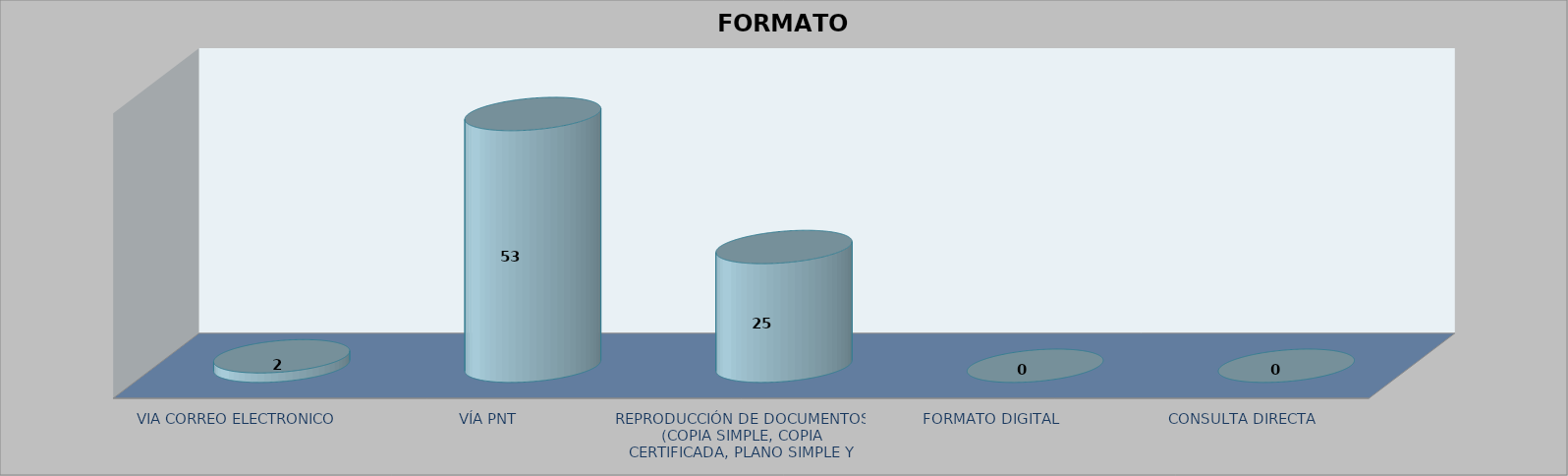
| Category |        FORMATO SOLICITADO | Series 1 | Series 2 |
|---|---|---|---|
| VIA CORREO ELECTRONICO |  |  | 2 |
| VÍA PNT |  |  | 53 |
| REPRODUCCIÓN DE DOCUMENTOS (COPIA SIMPLE, COPIA CERTIFICADA, PLANO SIMPLE Y PLANO CERTIFICADO) |  |  | 25 |
| FORMATO DIGITAL |  |  | 0 |
| CONSULTA DIRECTA |  |  | 0 |